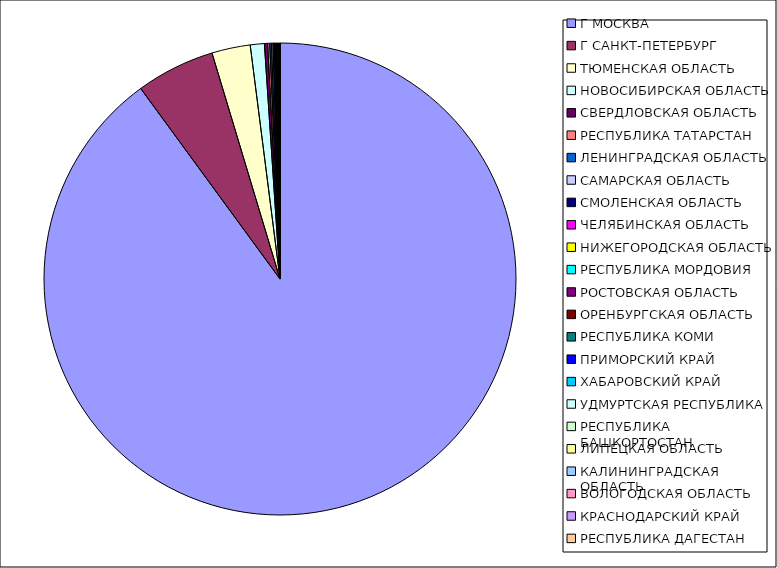
| Category | Оборот |
|---|---|
| Г МОСКВА | 0.899 |
| Г САНКТ-ПЕТЕРБУРГ | 0.054 |
| ТЮМЕНСКАЯ ОБЛАСТЬ | 0.026 |
| НОВОСИБИРСКАЯ ОБЛАСТЬ | 0.01 |
| СВЕРДЛОВСКАЯ ОБЛАСТЬ | 0.002 |
| РЕСПУБЛИКА ТАТАРСТАН | 0.001 |
| ЛЕНИНГРАДСКАЯ ОБЛАСТЬ | 0.001 |
| САМАРСКАЯ ОБЛАСТЬ | 0.001 |
| СМОЛЕНСКАЯ ОБЛАСТЬ | 0.001 |
| ЧЕЛЯБИНСКАЯ ОБЛАСТЬ | 0.001 |
| НИЖЕГОРОДСКАЯ ОБЛАСТЬ | 0.001 |
| РЕСПУБЛИКА МОРДОВИЯ | 0 |
| РОСТОВСКАЯ ОБЛАСТЬ | 0 |
| ОРЕНБУРГСКАЯ ОБЛАСТЬ | 0 |
| РЕСПУБЛИКА КОМИ | 0 |
| ПРИМОРСКИЙ КРАЙ | 0 |
| ХАБАРОВСКИЙ КРАЙ | 0 |
| УДМУРТСКАЯ РЕСПУБЛИКА | 0 |
| РЕСПУБЛИКА БАШКОРТОСТАН | 0 |
| ЛИПЕЦКАЯ ОБЛАСТЬ | 0 |
| КАЛИНИНГРАДСКАЯ ОБЛАСТЬ | 0 |
| ВОЛОГОДСКАЯ ОБЛАСТЬ | 0 |
| КРАСНОДАРСКИЙ КРАЙ | 0 |
| РЕСПУБЛИКА ДАГЕСТАН | 0 |
| САХАЛИНСКАЯ ОБЛАСТЬ | 0 |
| ИРКУТСКАЯ ОБЛАСТЬ | 0 |
| ИВАНОВСКАЯ ОБЛАСТЬ | 0 |
| КАМЧАТСКИЙ КРАЙ | 0 |
| САРАТОВСКАЯ ОБЛАСТЬ | 0 |
| ОМСКАЯ ОБЛАСТЬ | 0 |
| КАРАЧАЕВО-ЧЕРКЕССКАЯ РЕСПУБЛИКА | 0 |